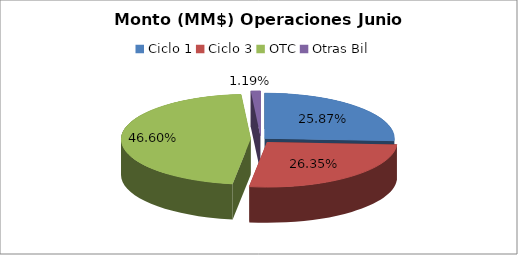
| Category | Series 0 |
|---|---|
| Ciclo 1 | 18582577.233 |
| Ciclo 3 | 18927801.519 |
| OTC | 33476806.263 |
| Otras Bil | 855141.972 |